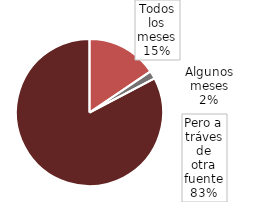
| Category | Series 0 |
|---|---|
| Todos los meses | 0.156 |
| Algunos meses | 0.018 |
| Pero a tráves de otra fuente | 0.827 |